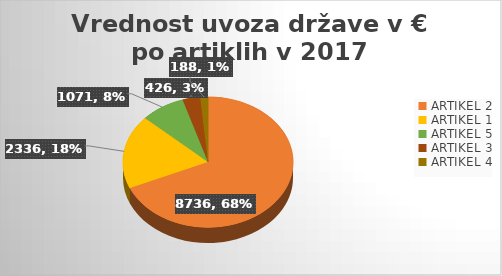
| Category | Series 0 |
|---|---|
| ARTIKEL 2 | 8736 |
| ARTIKEL 1 | 2336.4 |
| ARTIKEL 5 | 1070.51 |
| ARTIKEL 3 | 426.4 |
| ARTIKEL 4 | 188.1 |